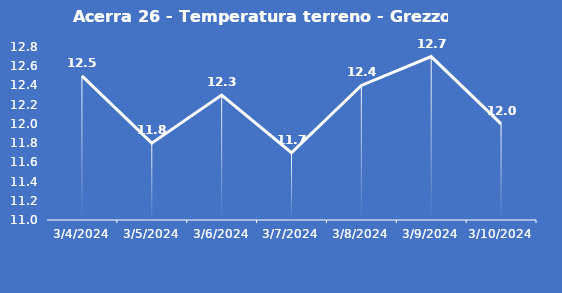
| Category | Acerra 26 - Temperatura terreno - Grezzo (°C) |
|---|---|
| 3/4/24 | 12.5 |
| 3/5/24 | 11.8 |
| 3/6/24 | 12.3 |
| 3/7/24 | 11.7 |
| 3/8/24 | 12.4 |
| 3/9/24 | 12.7 |
| 3/10/24 | 12 |